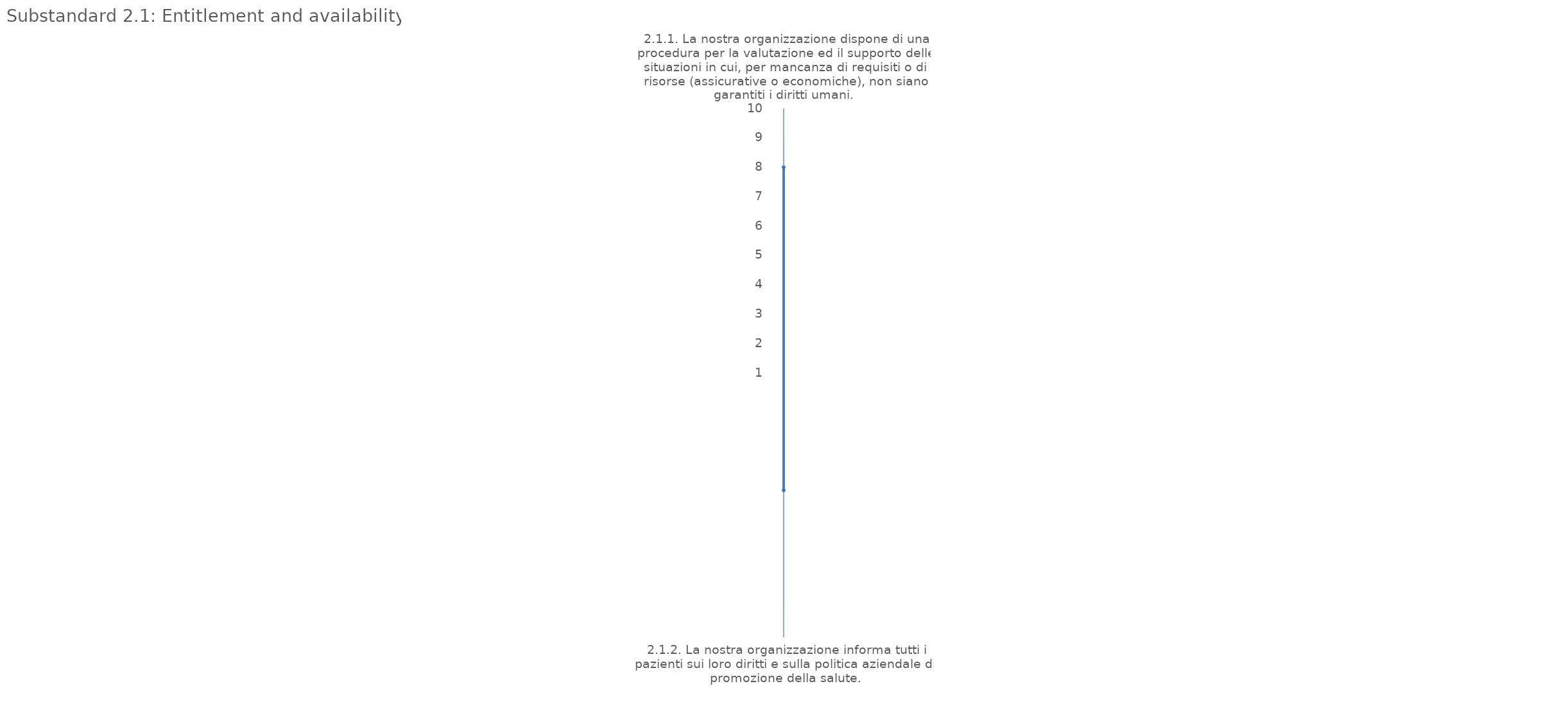
| Category | value |
|---|---|
| 2.1.1. La nostra organizzazione dispone di una procedura per la valutazione ed il supporto delle situazioni in cui, per mancanza di requisiti o di risorse (assicurative o economiche), non siano garantiti i diritti umani. | 8 |
| 2.1.2. La nostra organizzazione informa tutti i pazienti sui loro diritti e sulla politica aziendale di promozione della salute. | 5 |